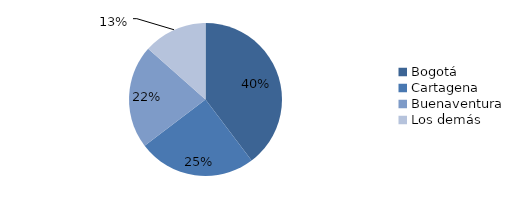
| Category | Series 0 |
|---|---|
| Bogotá | 1419.863 |
| Cartagena | 891.774 |
| Buenaventura | 781.749 |
| Los demás | 482.211 |